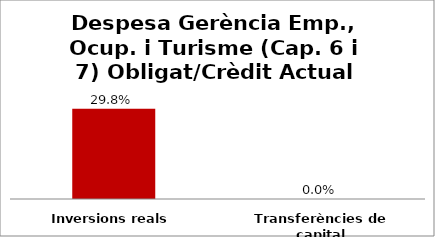
| Category | Series 0 |
|---|---|
| Inversions reals | 0.298 |
| Transferències de capital | 0 |